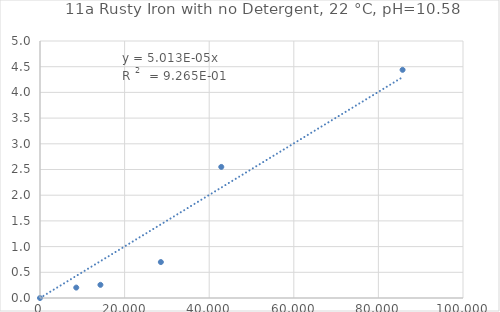
| Category | Series 0 |
|---|---|
| 0.0 | 0 |
| 8571.428571428572 | 0.203 |
| 14285.714285714286 | 0.256 |
| 28571.428571428572 | 0.699 |
| 42857.14285714286 | 2.55 |
| 85714.28571428572 | 4.439 |